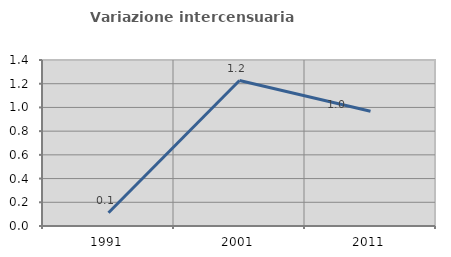
| Category | Variazione intercensuaria annua |
|---|---|
| 1991.0 | 0.111 |
| 2001.0 | 1.227 |
| 2011.0 | 0.968 |